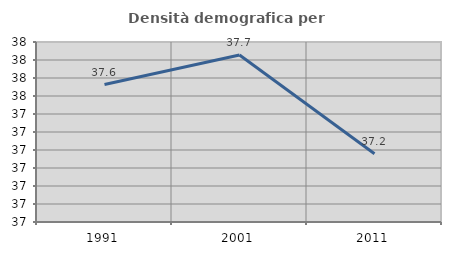
| Category | Densità demografica |
|---|---|
| 1991.0 | 37.563 |
| 2001.0 | 37.728 |
| 2011.0 | 37.18 |